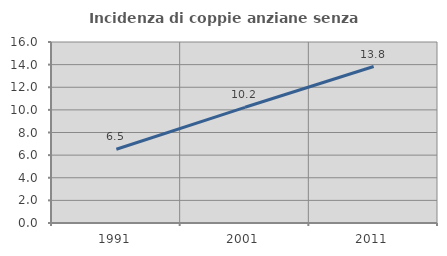
| Category | Incidenza di coppie anziane senza figli  |
|---|---|
| 1991.0 | 6.522 |
| 2001.0 | 10.227 |
| 2011.0 | 13.83 |